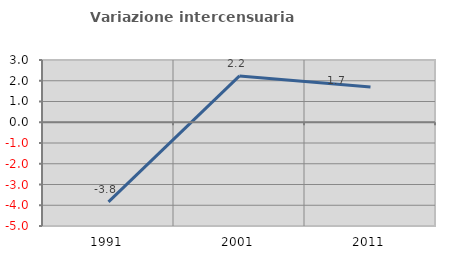
| Category | Variazione intercensuaria annua |
|---|---|
| 1991.0 | -3.841 |
| 2001.0 | 2.234 |
| 2011.0 | 1.696 |